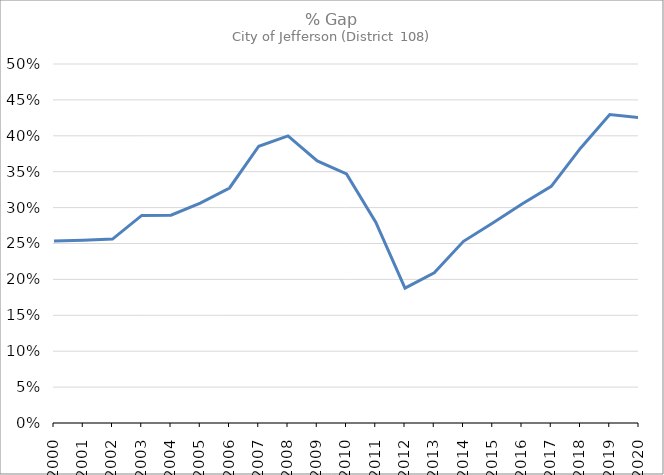
| Category | % Gap |
|---|---|
| 2000.0 | 0.253 |
| 2001.0 | 0.254 |
| 2002.0 | 0.256 |
| 2003.0 | 0.289 |
| 2004.0 | 0.289 |
| 2005.0 | 0.306 |
| 2006.0 | 0.327 |
| 2007.0 | 0.385 |
| 2008.0 | 0.4 |
| 2009.0 | 0.365 |
| 2010.0 | 0.347 |
| 2011.0 | 0.28 |
| 2012.0 | 0.188 |
| 2013.0 | 0.209 |
| 2014.0 | 0.253 |
| 2015.0 | 0.279 |
| 2016.0 | 0.305 |
| 2017.0 | 0.33 |
| 2018.0 | 0.383 |
| 2019.0 | 0.43 |
| 2020.0 | 0.425 |